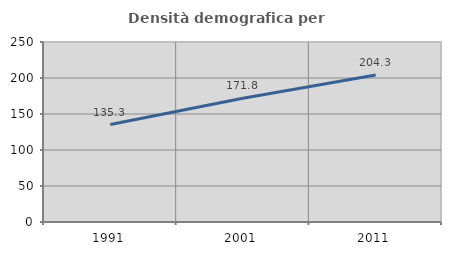
| Category | Densità demografica |
|---|---|
| 1991.0 | 135.316 |
| 2001.0 | 171.76 |
| 2011.0 | 204.282 |